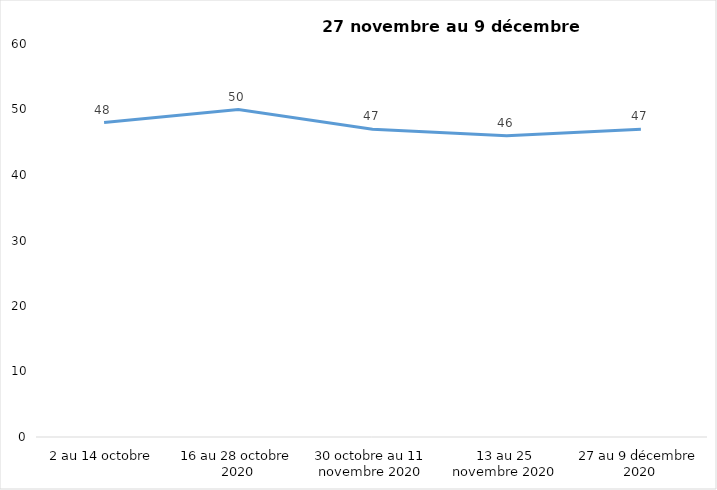
| Category | Series 0 |
|---|---|
| 2 au 14 octobre | 48 |
| 16 au 28 octobre 2020 | 50 |
| 30 octobre au 11 novembre 2020 | 47 |
| 13 au 25 novembre 2020 | 46 |
| 27 au 9 décembre 2020 | 47 |